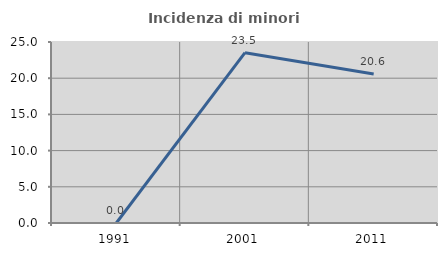
| Category | Incidenza di minori stranieri |
|---|---|
| 1991.0 | 0 |
| 2001.0 | 23.529 |
| 2011.0 | 20.571 |